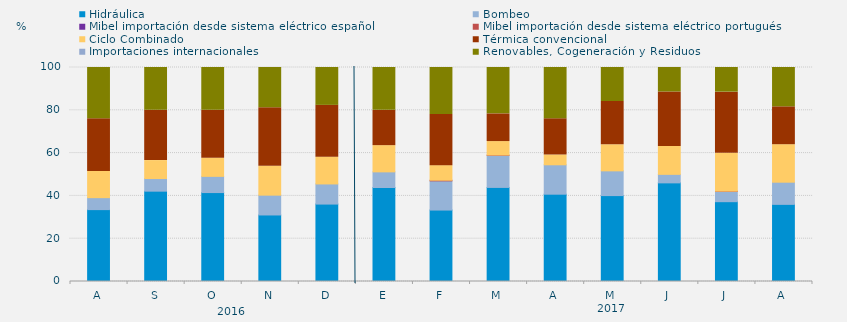
| Category | Hidráulica | Bombeo | Mibel importación desde sistema eléctrico español | Mibel importación desde sistema eléctrico portugués | Ciclo Combinado | Térmica convencional | Importaciones internacionales | Renovables, Cogeneración y Residuos |
|---|---|---|---|---|---|---|---|---|
| A | 33.591 | 5.589 | 0 | 0 | 12.265 | 24.597 | 0 | 23.958 |
| S | 42.211 | 5.903 | 0 | 0 | 8.391 | 23.542 | 0 | 19.954 |
| O | 41.555 | 7.572 | 0 | 0 | 8.468 | 22.469 | 0 | 19.937 |
| N | 31.088 | 9.259 | 0 | 0 | 13.495 | 27.361 | 0 | 18.796 |
| D | 36.178 | 9.409 | 0 | 0 | 12.522 | 24.194 | 0 | 17.697 |
| E | 43.929 | 7.303 | 0 | 0 | 12.254 | 16.51 | 0 | 20.004 |
| F | 33.383 | 13.641 | 0 | 0.298 | 6.82 | 23.884 | 0 | 21.974 |
| M | 43.966 | 14.984 | 0 | 0.135 | 6.303 | 12.943 | 0 | 21.669 |
| A | 40.799 | 13.738 | 0 | 0 | 4.583 | 16.933 | 0 | 23.947 |
| M | 40.143 | 11.559 | 0 | 0 | 12.186 | 20.228 | 0 | 15.883 |
| J | 46.088 | 3.981 | 0 | 0 | 13.032 | 25.463 | 0 | 11.435 |
| J | 37.298 | 4.783 | 0 | 0.134 | 17.675 | 28.595 | 0 | 11.514 |
| A | 36.044 | 10.361 | 0 | 0 | 17.518 | 17.708 | 0 | 18.369 |